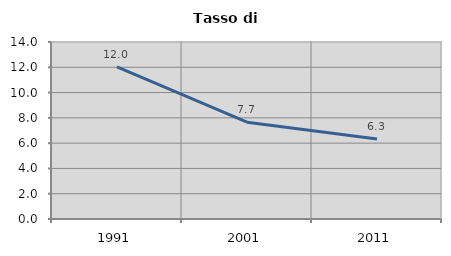
| Category | Tasso di disoccupazione   |
|---|---|
| 1991.0 | 12.025 |
| 2001.0 | 7.659 |
| 2011.0 | 6.335 |